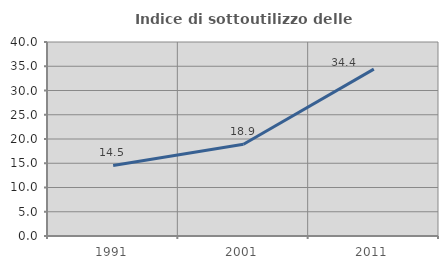
| Category | Indice di sottoutilizzo delle abitazioni  |
|---|---|
| 1991.0 | 14.545 |
| 2001.0 | 18.908 |
| 2011.0 | 34.411 |